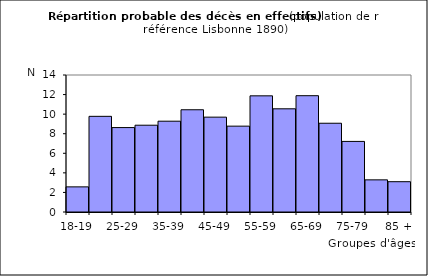
| Category | Series 0 |
|---|---|
| 18-19 | 2.568 |
| 20-24 | 9.777 |
| 25-29 | 8.627 |
| 30-34 | 8.869 |
| 35-39 | 9.279 |
| 40-44 | 10.448 |
| 45-49 | 9.693 |
| 50-54 | 8.773 |
| 55-59 | 11.87 |
| 60-64 | 10.546 |
| 65-69 | 11.886 |
| 70-74 | 9.07 |
| 75-79 | 7.213 |
| 80-84 | 3.286 |
| 85 + | 3.096 |